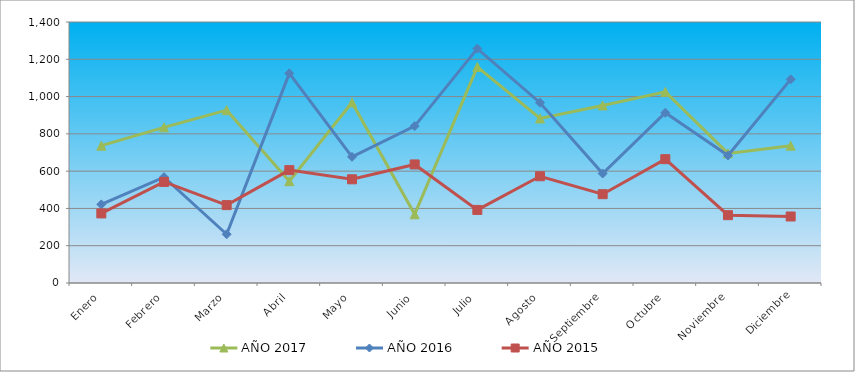
| Category | AÑO 2017 | AÑO 2016 | AÑO 2015 |
|---|---|---|---|
| Enero | 736.608 | 421.694 | 373.144 |
| Febrero | 835.035 | 567.756 | 542.114 |
| Marzo | 927.111 | 261.459 | 417.733 |
| Abril | 546.106 | 1124.631 | 605.478 |
| Mayo | 968.386 | 676.928 | 556.195 |
| Junio | 368.304 | 841.683 | 635.987 |
| Julio | 1158.888 | 1257.151 | 391.918 |
| Agosto | 882.66 | 967.04 | 572.623 |
| Septiembre | 952.511 | 587.387 | 476.403 |
| Octubre | 1025.537 | 913.315 | 664.149 |
| Noviembre | 695.333 | 684.091 | 363.756 |
| Diciembre | 736.608 | 1092.396 | 356.716 |